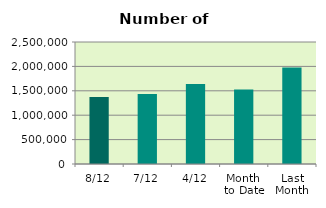
| Category | Series 0 |
|---|---|
| 8/12 | 1373736 |
| 7/12 | 1436674 |
| 4/12 | 1641392 |
| Month 
to Date | 1527372.667 |
| Last
Month | 1976001.238 |